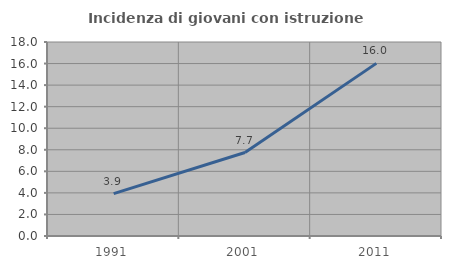
| Category | Incidenza di giovani con istruzione universitaria |
|---|---|
| 1991.0 | 3.934 |
| 2001.0 | 7.744 |
| 2011.0 | 16.017 |